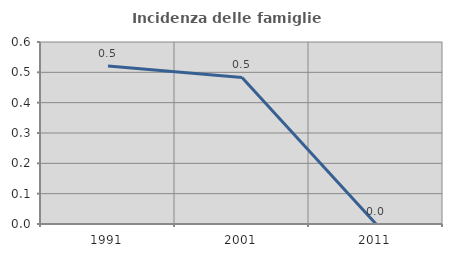
| Category | Incidenza delle famiglie numerose |
|---|---|
| 1991.0 | 0.521 |
| 2001.0 | 0.483 |
| 2011.0 | 0 |